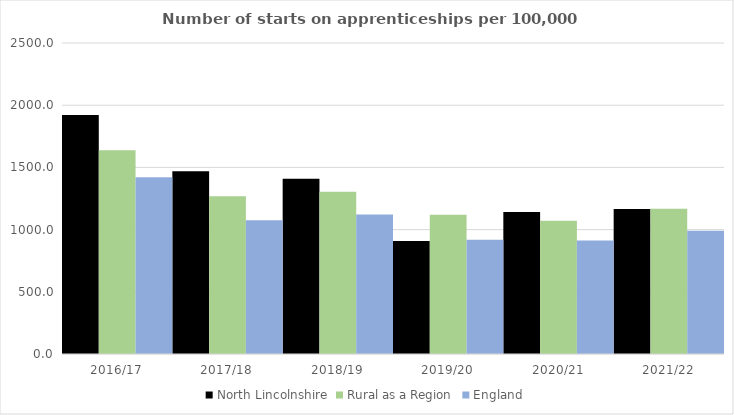
| Category | North Lincolnshire | Rural as a Region | England |
|---|---|---|---|
| 2016/17 | 1922 | 1638.789 | 1420 |
| 2017/18 | 1470 | 1267.474 | 1075 |
| 2018/19 | 1409 | 1304.57 | 1122 |
| 2019/20 | 908 | 1119.662 | 918 |
| 2020/21 | 1141 | 1070.748 | 912 |
| 2021/22 | 1166 | 1167.68 | 991 |